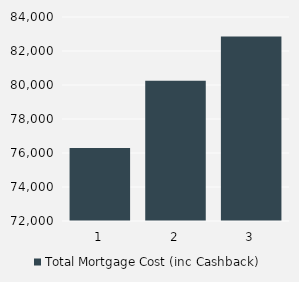
| Category | Total Mortgage Cost (inc Cashback) |
|---|---|
| 0 | 76293.781 |
| 1 | 80251.012 |
| 2 | 82858.036 |